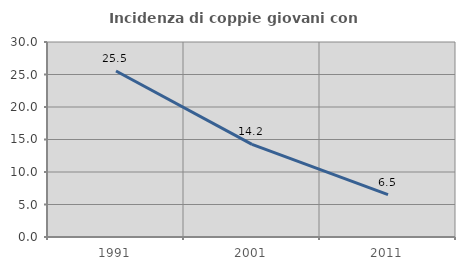
| Category | Incidenza di coppie giovani con figli |
|---|---|
| 1991.0 | 25.53 |
| 2001.0 | 14.247 |
| 2011.0 | 6.516 |